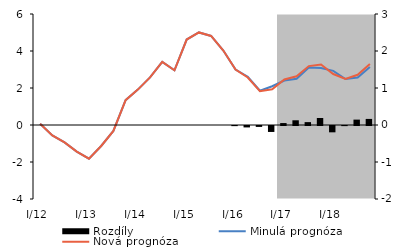
| Category | Rozdíly |
|---|---|
| I/12 | 0 |
| II | 0 |
| III | 0 |
| IV | 0 |
| I/13 | 0 |
| II | 0 |
| III | 0 |
| IV | 0 |
| I/14 | 0 |
| II | 0 |
| III | 0 |
| IV | 0 |
| I/15 | 0 |
| II | 0 |
| III | 0 |
| IV | 0 |
| I/16 | -0.004 |
| II | -0.038 |
| III | -0.025 |
| IV | -0.161 |
| I/17 | 0.052 |
| II | 0.127 |
| III | 0.078 |
| IV | 0.189 |
| I/18 | -0.171 |
| II | -0.003 |
| III | 0.146 |
| IV | 0.164 |